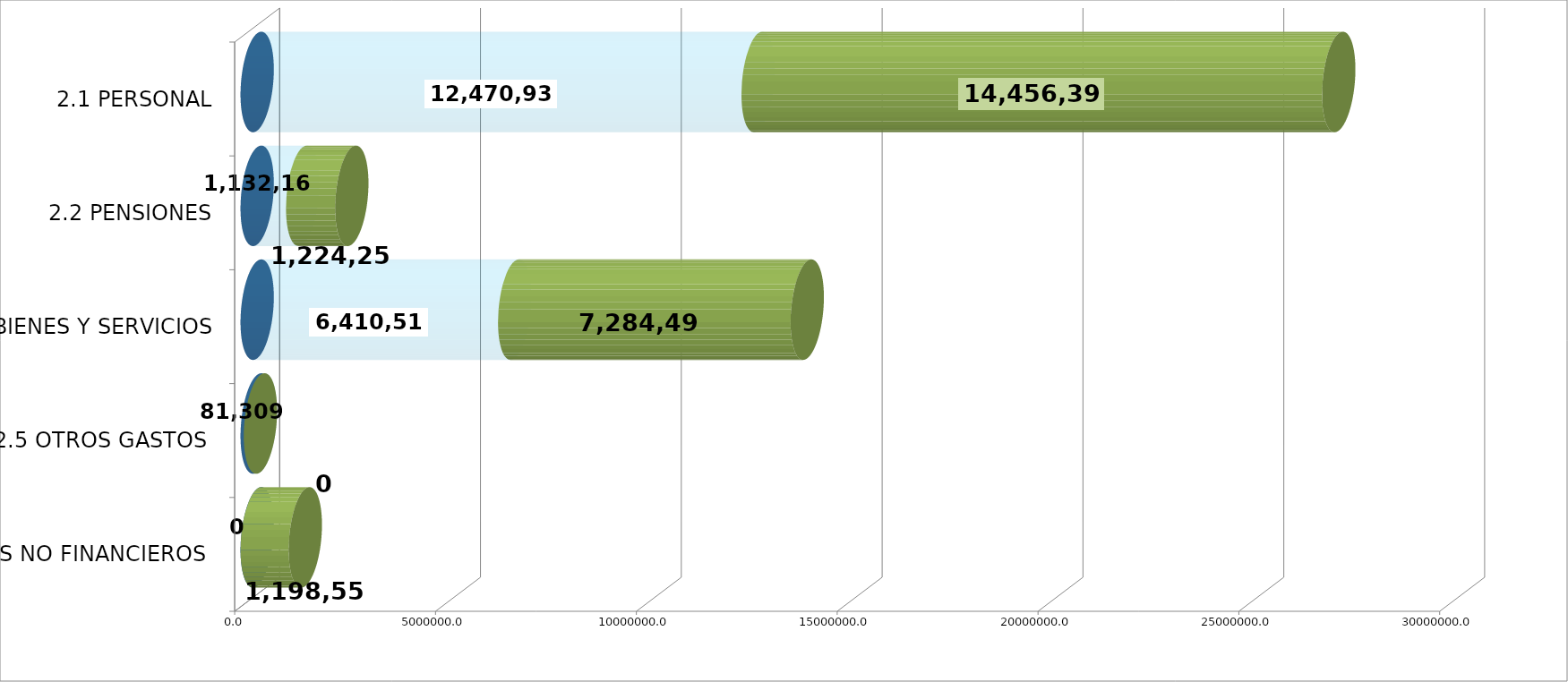
| Category | GENERICA | EJECUTADO | SALDO  |
|---|---|---|---|
| 2.1 PERSONAL | 0 | 12470936.99 | 14456396.01 |
| 2.2 PENSIONES | 0 | 1132165.57 | 1224256.43 |
| 2.3 BIENES Y SERVICIOS | 0 | 6410511.82 | 7284494.18 |
| 2.5 OTROS GASTOS  | 0 | 81309 | 0 |
| 2.6 ACTIVOS NO FINANCIEROS  | 0 | 0 | 1198556 |